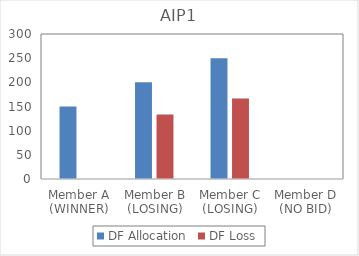
| Category | DF Allocation | DF Loss |
|---|---|---|
| Member A (WINNER) | 150 | 0 |
| Member B (LOSING) | 200 | 133.333 |
| Member C (LOSING) | 250 | 166.667 |
| Member D (NO BID) | 0 | 0 |